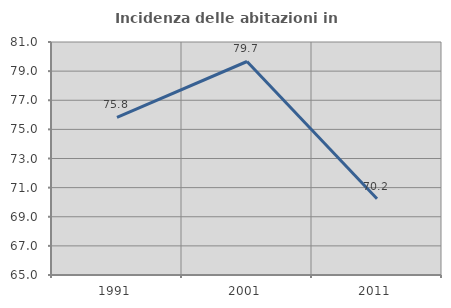
| Category | Incidenza delle abitazioni in proprietà  |
|---|---|
| 1991.0 | 75.824 |
| 2001.0 | 79.661 |
| 2011.0 | 70.238 |